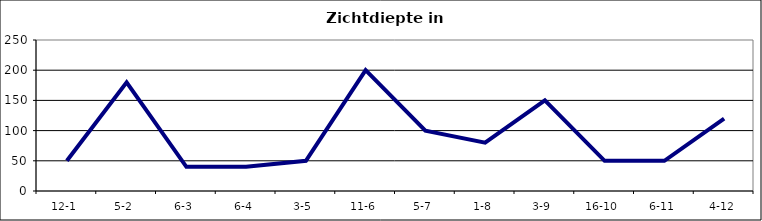
| Category | Zichtdiepte in cm |
|---|---|
| 12-1 | 50 |
| 5-2 | 180 |
| 6-3 | 40 |
| 6-4 | 40 |
| 3-5 | 50 |
| 11-6 | 200 |
| 5-7 | 100 |
| 1-8 | 80 |
| 3-9 | 150 |
| 16-10 | 50 |
| 6-11 | 50 |
| 4-12 | 120 |